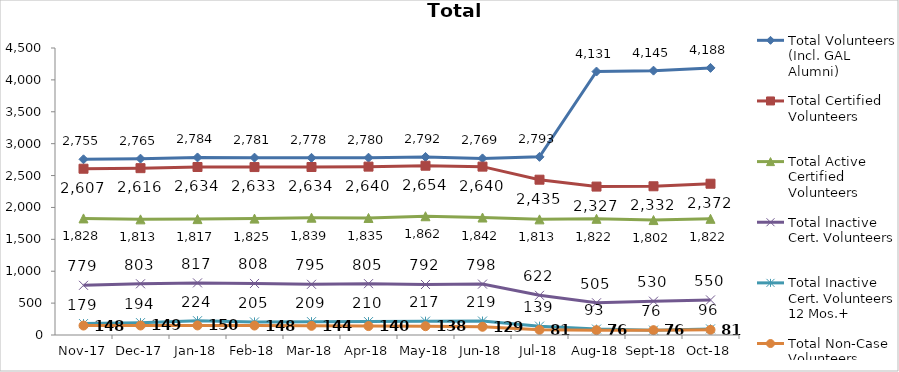
| Category | Total Volunteers (Incl. GAL Alumni) | Total Certified Volunteers | Total Active Certified Volunteers | Total Inactive Cert. Volunteers | Total Inactive Cert. Volunteers 12 Mos.+ | Total Non-Case Volunteers |
|---|---|---|---|---|---|---|
| 2017-11-01 | 2755 | 2607 | 1828 | 779 | 179 | 148 |
| 2017-12-01 | 2765 | 2616 | 1813 | 803 | 194 | 149 |
| 2018-01-01 | 2784 | 2634 | 1817 | 817 | 224 | 150 |
| 2018-02-01 | 2781 | 2633 | 1825 | 808 | 205 | 148 |
| 2018-03-01 | 2778 | 2634 | 1839 | 795 | 209 | 144 |
| 2018-04-01 | 2780 | 2640 | 1835 | 805 | 210 | 140 |
| 2018-05-01 | 2792 | 2654 | 1862 | 792 | 217 | 138 |
| 2018-06-01 | 2769 | 2640 | 1842 | 798 | 219 | 129 |
| 2018-07-01 | 2793 | 2435 | 1813 | 622 | 139 | 81 |
| 2018-08-01 | 4131 | 2327 | 1822 | 505 | 93 | 76 |
| 2018-09-01 | 4145 | 2332 | 1802 | 530 | 76 | 76 |
| 2018-10-01 | 4188 | 2372 | 1822 | 550 | 96 | 81 |